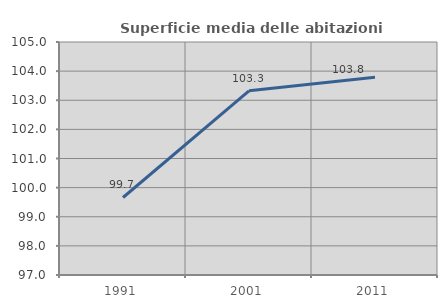
| Category | Superficie media delle abitazioni occupate |
|---|---|
| 1991.0 | 99.661 |
| 2001.0 | 103.325 |
| 2011.0 | 103.79 |